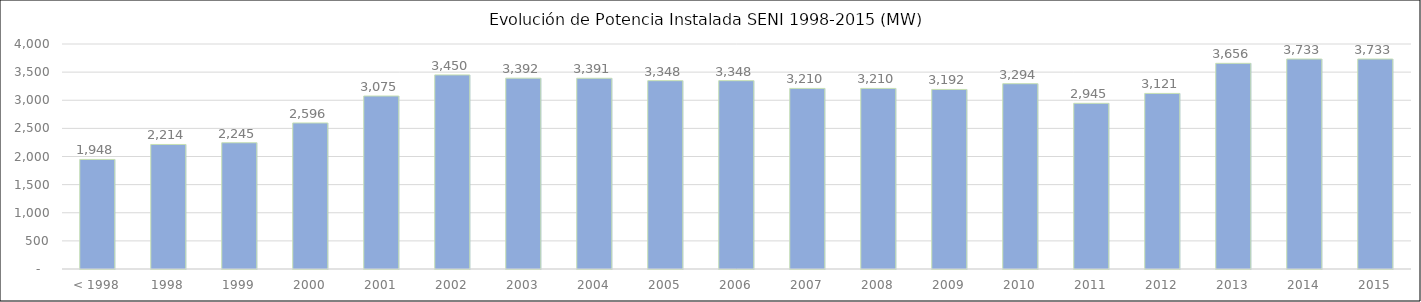
| Category | Parque de Generacion Disponible (MW) |
|---|---|
| < 1998 | 1947.762 |
| 1998 | 2213.812 |
| 1999 | 2244.612 |
| 2000 | 2596.172 |
| 2001 | 3075.106 |
| 2002 | 3450.406 |
| 2003 | 3392.306 |
| 2004 | 3390.806 |
| 2005 | 3348.006 |
| 2006 | 3348.006 |
| 2007 | 3210.006 |
| 2008 | 3210.006 |
| 2009 | 3191.706 |
| 2010 | 3294.356 |
| 2011 | 2945.356 |
| 2012 | 3121.324 |
| 2013 | 3656.324 |
| 2014 | 3733 |
| 2015 | 3733 |